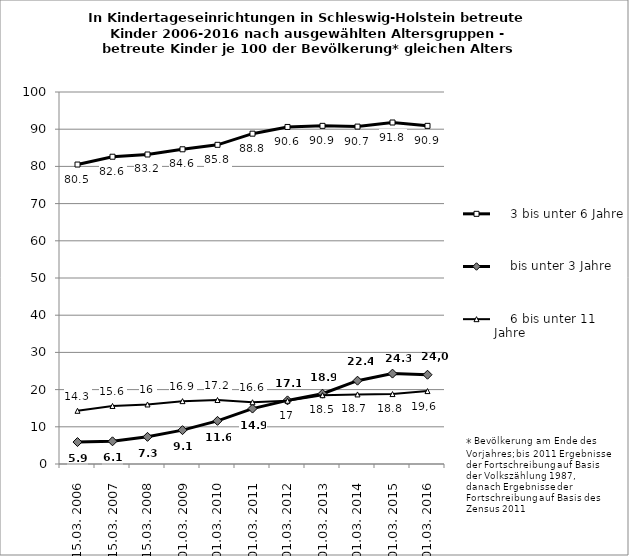
| Category |     3 bis unter 6 Jahre |     bis unter 3 Jahre |     6 bis unter 11 Jahre |
|---|---|---|---|
| 15.03. 2006 | 80.5 | 5.9 | 14.3 |
| 15.03. 2007 | 82.6 | 6.1 | 15.6 |
| 15.03. 2008 | 83.2 | 7.3 | 16 |
| 01.03. 2009 | 84.6 | 9.1 | 16.9 |
| 01.03. 2010 | 85.8 | 11.6 | 17.2 |
| 01.03. 2011 | 88.8 | 14.9 | 16.6 |
| 01.03. 2012 | 90.6 | 17.1 | 17 |
| 01.03. 2013 | 90.9 | 18.9 | 18.5 |
| 01.03. 2014 | 90.7 | 22.4 | 18.7 |
| 01.03. 2015 | 91.8 | 24.3 | 18.8 |
| 01.03. 2016 | 90.9 | 24 | 19.6 |